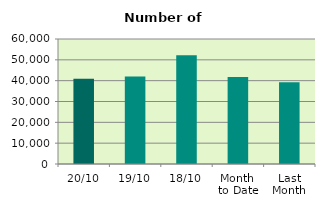
| Category | Series 0 |
|---|---|
| 20/10 | 40958 |
| 19/10 | 41966 |
| 18/10 | 52206 |
| Month 
to Date | 41764.857 |
| Last
Month | 39229.818 |